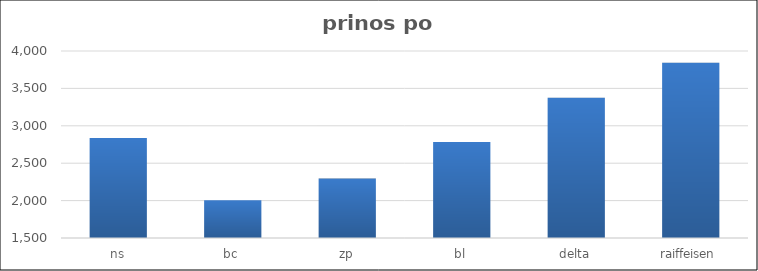
| Category | Series 0 |
|---|---|
| ns | 2838 |
| bc | 2006 |
| zp | 2294 |
| bl | 2784 |
| delta | 3376 |
| raiffeisen | 3843 |